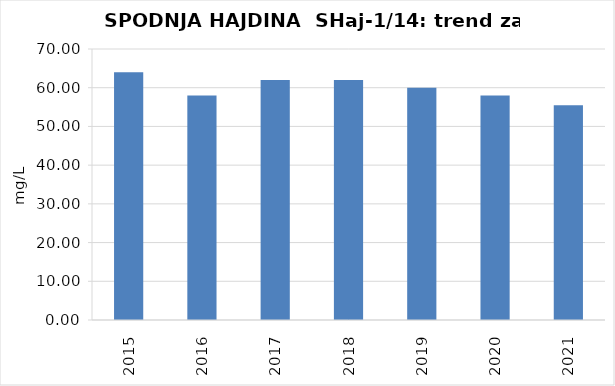
| Category | Vsota |
|---|---|
| 2015 | 64 |
| 2016 | 58 |
| 2017 | 62 |
| 2018 | 62 |
| 2019 | 60 |
| 2020 | 58 |
| 2021 | 55.5 |